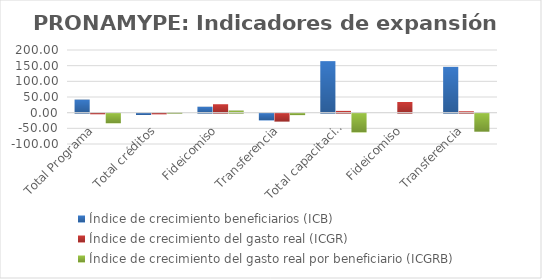
| Category | Índice de crecimiento beneficiarios (ICB)  | Índice de crecimiento del gasto real (ICGR)  | Índice de crecimiento del gasto real por beneficiario (ICGRB)  |
|---|---|---|---|
| Total Programa | 41.713 | -2.009 | -30.853 |
| Total créditos | -4.175 | -2.21 | 2.05 |
| Fideicomiso | 18.943 | 26.937 | 6.721 |
| Transferencia | -21.667 | -25.372 | -4.73 |
| Total capacitación | 164.467 | 5.669 | -60.044 |
| Fideicomiso | 0 | 34.053 | 0 |
| Transferencia | 146.193 | 4.513 | -57.548 |